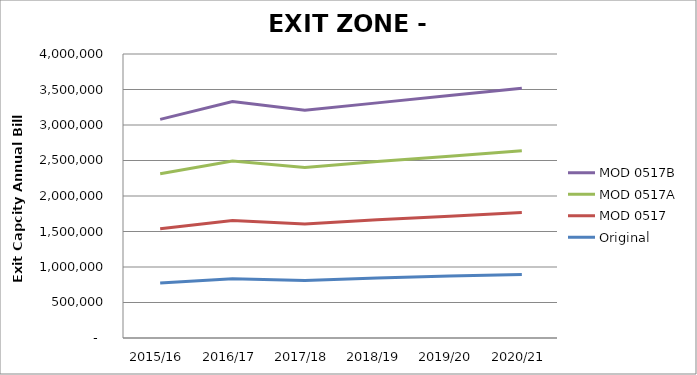
| Category | Original | MOD 0517 | MOD 0517A | MOD 0517B |
|---|---|---|---|---|
| 2015/16 | 775111.589 | 763047.595 | 775111.589 | 766063.594 |
| 2016/17 | 835431.557 | 820351.565 | 835431.557 | 838447.555 |
| 2017/18 | 808287.571 | 796223.578 | 796223.578 | 808287.571 |
| 2018/19 | 844479.552 | 820351.565 | 820351.565 | 826383.562 |
| 2019/20 | 871623.538 | 844479.552 | 844479.552 | 853527.547 |
| 2020/21 | 895751.525 | 871623.538 | 871623.538 | 877655.534 |